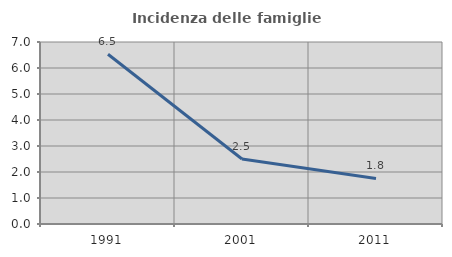
| Category | Incidenza delle famiglie numerose |
|---|---|
| 1991.0 | 6.527 |
| 2001.0 | 2.501 |
| 2011.0 | 1.754 |